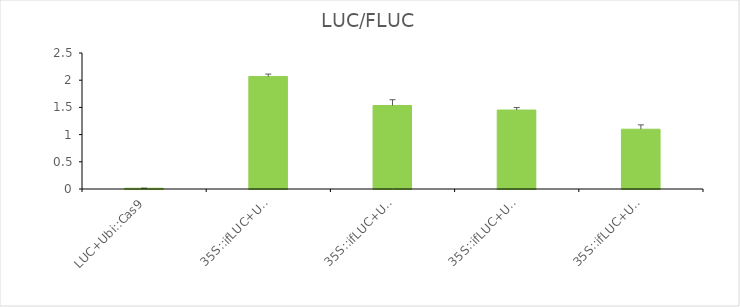
| Category | LUC/FLUC |
|---|---|
| LUC+Ubi::Cas9 | 0.014 |
| 35S::ifLUC+Ubi::Cas9 | 2.068 |
| 35S::ifLUC+Ubi::Cas9+OsU6a::sgRNA | 1.535 |
| 35S::ifLUC+Ubi::Cas9+MaU6c::sgRNA | 1.451 |
| 35S::ifLUC+Ubi::opCas9+MaU6c::sgRNA | 1.099 |